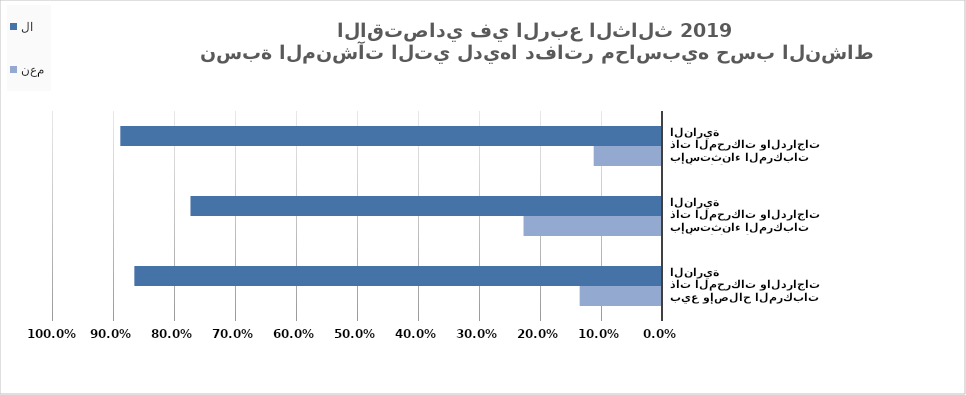
| Category | نعم | لا |
|---|---|---|
| بيع وإصلاح المركبات ذات المحركات والدراجات النارية | 0.135 | 0.865 |
| تجارة الجملة، بإستثناء المركبات ذات المحركات والدراجات النارية | 0.227 | 0.773 |
| تجارة التجزئة، بإستثناء المركبات ذات المحركات والدراجات النارية | 0.112 | 0.888 |